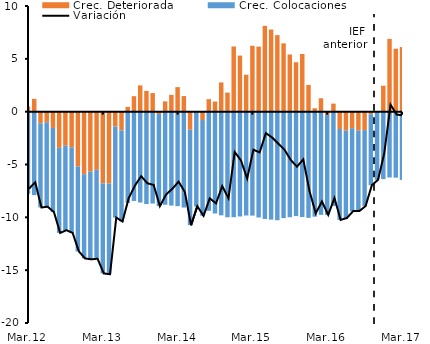
| Category | Crec. Deteriorada | Crec. Colocaciones |
|---|---|---|
| Mar.12 | 0.489 | -7.77 |
| Abr.12 | 1.21 | -7.899 |
| May.12 | -1.099 | -7.965 |
| Jun.12 | -1.002 | -7.994 |
| Jul.12 | -1.541 | -7.962 |
| Ago.12 | -3.426 | -8.05 |
| Sep.12 | -3.206 | -8.011 |
| Oct.12 | -3.376 | -8.095 |
| Nov.12 | -5.185 | -8.04 |
| Dic.12 | -5.92 | -7.969 |
| Ene.13 | -5.68 | -8.296 |
| Feb.13 | -5.503 | -8.415 |
| Mar.13 | -6.79 | -8.518 |
| Abr.13 | -6.807 | -8.578 |
| May.13 | -1.401 | -8.625 |
| Jun.13 | -1.781 | -8.612 |
| Jul.13 | 0.453 | -8.634 |
| Ago.13 | 1.467 | -8.451 |
| Sep.13 | 2.488 | -8.599 |
| Oct.13 | 1.966 | -8.746 |
| Nov.13 | 1.761 | -8.698 |
| Dic.13 | -0.226 | -8.712 |
| Ene.14 | 0.977 | -8.812 |
| Feb.14 | 1.588 | -8.886 |
| Mar.14 | 2.322 | -8.942 |
| Abr.14 | 1.475 | -9.071 |
| May.14 | -1.709 | -9.038 |
| Jun.14 | 0.04 | -8.985 |
| Jul.14 | -0.792 | -9.067 |
| Ago.14 | 1.184 | -9.386 |
| Sep.14 | 0.957 | -9.636 |
| Oct.14 | 2.767 | -9.814 |
| Nov.14 | 1.806 | -9.994 |
| Dic.14 | 6.167 | -9.986 |
| Ene.15 | 5.309 | -9.918 |
| Feb.15 | 3.496 | -9.826 |
| Mar.15 | 6.237 | -9.838 |
| Abr.15 | 6.158 | -10.015 |
| May.15 | 8.121 | -10.153 |
| Jun.15 | 7.777 | -10.216 |
| Jul.15 | 7.243 | -10.275 |
| Ago.15 | 6.465 | -10.075 |
| Sep.15 | 5.409 | -9.99 |
| Oct.15 | 4.68 | -9.883 |
| Nov.15 | 5.457 | -9.968 |
| Dic.15 | 2.53 | -10.048 |
| Ene.16 | 0.323 | -9.94 |
| Feb.16 | 1.269 | -9.765 |
| Mar.16 | -0.319 | -9.454 |
| Abr.16 | 0.761 | -8.928 |
| May.16 | -1.639 | -8.604 |
| Jun.16 | -1.802 | -8.262 |
| Jul.16 | -1.558 | -7.853 |
| Ago.16 | -1.805 | -7.601 |
| Sep.16 | -1.74 | -7.191 |
| Oct.16 | -0.241 | -6.72 |
| Nov.16 | 0.013 | -6.457 |
| Dic.16 | 2.456 | -6.382 |
| Ene.17 | 6.885 | -6.227 |
| Feb.17 | 5.961 | -6.243 |
| Mar.17 | 6.115 | -6.456 |